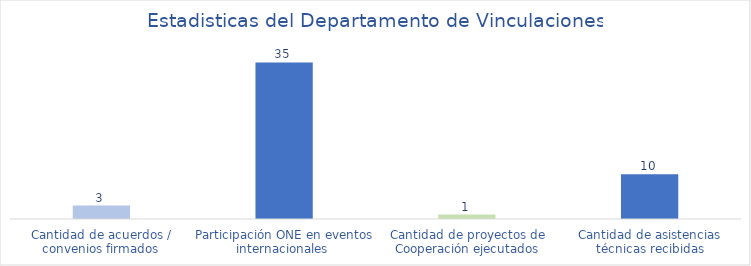
| Category | Series 0 |
|---|---|
| Cantidad de acuerdos / convenios firmados | 3 |
| Participación ONE en eventos internacionales  | 35 |
| Cantidad de proyectos de Cooperación ejecutados | 1 |
| Cantidad de asistencias técnicas recibidas | 10 |